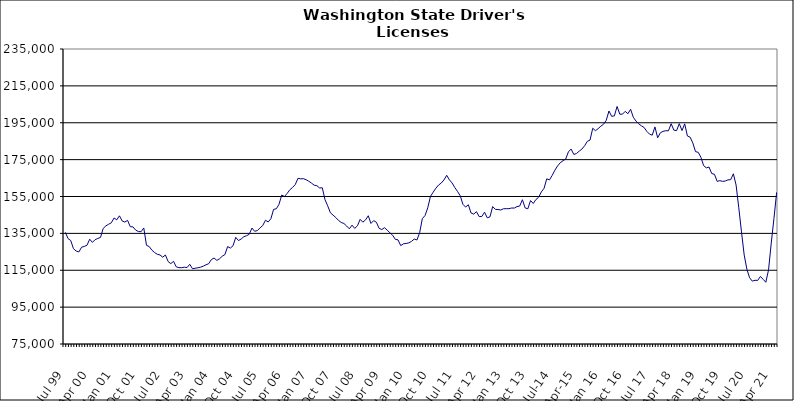
| Category | Series 0 |
|---|---|
| Jul 99 | 135560 |
| Aug 99 | 132182 |
| Sep 99 | 131104 |
| Oct 99 | 126694 |
| Nov 99 | 125425 |
| Dec 99 | 124927 |
| Jan 00 | 127499 |
| Feb 00 | 127927 |
| Mar 00 | 128547 |
| Apr 00 | 131834 |
| May 00 | 130120 |
| Jun 00 | 131595 |
| Jul 00 | 132236 |
| Aug 00 | 132819 |
| Sep 00 | 137711 |
| Oct 00 | 139063 |
| Nov 00 | 139952 |
| Dec 00 | 140732 |
| Jan 01 | 143338 |
| Feb 01 | 142359 |
| Mar 01 | 144523 |
| Apr 01 | 141758 |
| May 01 | 141135 |
| Jun 01 | 142064 |
| Jul 01 | 138646 |
| Aug 01 | 138530 |
| Sep 01 | 136784 |
| Oct 01 | 135996 |
| Nov 01 | 135917 |
| Dec 01 | 137940 |
| Jan 02 | 128531 |
| Feb 02 | 127848 |
| Mar 02 | 125876 |
| Apr 02 | 124595 |
| May 02 | 123660 |
| Jun 02 | 123282 |
| Jul 02 | 122089 |
| Aug 02 | 123279 |
| Sep 02 | 119727 |
| Oct 02 | 118588 |
| Nov 02 | 119854 |
| Dec 02 | 116851 |
| Jan 03 | 116407 |
| Feb 03 | 116382 |
| Mar 03 | 116648 |
| Apr 03 | 116471 |
| May 03 | 118231 |
| Jun 03 | 115831 |
| Jul 03 | 116082 |
| Aug 03 | 116341 |
| Sep 03 | 116653 |
| Oct 03 | 117212 |
| Nov 03 | 117962 |
| Dec 03 | 118542 |
| Jan 04 | 120817 |
| Feb 04 | 121617 |
| Mar 04 | 120369 |
| Apr 04 | 121200 |
| May 04 | 122609 |
| Jun 04 | 123484 |
| Jul 04 | 127844 |
| Aug 04 | 127025 |
| Sep 04 | 128273 |
| Oct 04 | 132853 |
| Nov 04 | 131106 |
| Dec 04 | 131935 |
| Jan 05 | 133205 |
| Feb 05 | 133736 |
| Mar 05 | 134528 |
| Apr 05 | 137889 |
| May 05 | 136130 |
| Jun 05 | 136523 |
| Jul 05 | 137997 |
| Aug 05 | 139294 |
| Sep 05 | 142140 |
| Oct 05 | 141192 |
| Nov 05 | 142937 |
| Dec 05 | 148013 |
| Jan 06 | 148341 |
| Feb 06 | 150744 |
| Mar 06 | 155794 |
| Apr 06 | 154984 |
| May 06 | 156651 |
| Jun 06 | 158638 |
| Jul 06 | 159911 |
| Aug 06 | 161445 |
| Sep 06 | 164852 |
| Oct 06 | 164570 |
| Nov 06 | 164679 |
| Dec 06 | 164127 |
| Jan 07 | 163271 |
| Feb 07 | 162273 |
| Mar 07 | 161140 |
| Apr 07 | 160860 |
| May 07 | 159633 |
| Jun 07 | 159724 |
| Jul 07 | 153303 |
| Aug 07 | 149939 |
| Sep 07 | 146172 |
| Oct 07 | 144876 |
| Nov 07 | 143613 |
| Dec 07 | 142022 |
| Jan 08 | 140909 |
| Feb 08 | 140368 |
| Mar 08 | 138998 |
| Apr 08 | 137471 |
| May 08 | 139453 |
| Jun 08 | 137680 |
| Jul 08 | 139120 |
| Aug 08 | 142612 |
| Sep-08 | 141071 |
| Oct 08 | 142313 |
| Nov 08 | 144556 |
| Dec 08 | 140394 |
| Jan 09 | 141903 |
| Feb 09 | 141036 |
| Mar 09 | 137751 |
| Apr 09 | 137060 |
| May 09 | 138101 |
| Jun 09 | 136739 |
| Jul 09 | 135317 |
| Aug 09 | 134020 |
| Sep 09 | 131756 |
| Oct 09 | 131488 |
| Nov 09 | 128370 |
| Dec 09 | 129323 |
| Jan 10 | 129531 |
| Feb 10 | 129848 |
| Mar 10 | 130654 |
| Apr 10 | 131929 |
| May 10 | 131429 |
| Jun 10 | 135357 |
| Jul 10 | 143032 |
| Aug 10 | 144686 |
| Sep 10 | 148856 |
| Oct 10 | 155042 |
| Nov 10 | 157328 |
| Dec 10 | 159501 |
| Jan 11 | 161221 |
| Feb 11 | 162312 |
| Mar 11 | 163996 |
| Apr 11 | 166495 |
| May 11 | 164040 |
| Jun 11 | 162324 |
| Jul 11 | 159862 |
| Aug 11 | 157738 |
| Sep 11 | 155430 |
| Oct 11 | 150762 |
| Nov 11 | 149255 |
| Dec 11 | 150533 |
| Jan 12 | 146068 |
| Feb 12 | 145446 |
| Mar 12 | 146788 |
| Apr 12 | 144110 |
| May 12 | 144162 |
| Jun 12 | 146482 |
| Jul 12 | 143445 |
| Aug 12 | 143950 |
| Sep 12 | 149520 |
| Oct 12 | 148033 |
| Nov 12 | 147926 |
| Dec 12 | 147674 |
| Jan 13 | 148360 |
| Feb-13 | 148388 |
| Mar-13 | 148414 |
| Apr 13 | 148749 |
| May 13 | 148735 |
| Jun-13 | 149521 |
| Jul 13 | 149837 |
| Aug 13 | 153252 |
| Sep 13 | 148803 |
| Oct 13 | 148315 |
| Nov 13 | 152804 |
| Dec 13 | 151209 |
| Jan 14 | 153357 |
| Feb-14 | 154608 |
| Mar 14 | 157479 |
| Apr 14 | 159441 |
| May 14 | 164591 |
| Jun 14 | 163995 |
| Jul-14 | 166411 |
| Aug-14 | 169272 |
| Sep 14 | 171565 |
| Oct 14 | 173335 |
| Nov 14 | 174406 |
| Dec 14 | 175302 |
| Jan 15 | 179204 |
| Feb 15 | 180737 |
| Mar 15 | 177810 |
| Apr-15 | 178331 |
| May 15 | 179601 |
| Jun-15 | 180729 |
| Jul 15 | 182540 |
| Aug 15 | 184924 |
| Sep 15 | 185620 |
| Oct 15 | 192002 |
| Nov 15 | 190681 |
| Dec 15 | 191795 |
| Jan 16 | 193132 |
| Feb 16 | 194206 |
| Mar 16 | 196319 |
| Apr 16 | 201373 |
| May 16 | 198500 |
| Jun 16 | 198743 |
| Jul 16 | 203841 |
| Aug 16 | 199630 |
| Sep 16 | 199655 |
| Oct 16 | 201181 |
| Nov 16 | 199888 |
| Dec 16 | 202304 |
| Jan 17 | 197977 |
| Feb 17 | 195889 |
| Mar 17 | 194438 |
| Apr 17 | 193335 |
| May 17 | 192430 |
| Jun 17 | 190298 |
| Jul 17 | 188832 |
| Aug 17 | 188264 |
| Sep 17 | 192738 |
| Oct 17 | 186856 |
| Nov 17 | 189537 |
| Dec 17 | 190341 |
| Jan 18 | 190670 |
| Feb 18 | 190645 |
| Mar 18 | 194476 |
| Apr 18 | 190971 |
| May 18 | 190707 |
| Jun 18 | 194516 |
| Jul 18 | 190783 |
| Aug 18 | 194390 |
| Sep 18 | 187831 |
| Oct 18 | 187188 |
| Nov 18 | 184054 |
| Dec 18 | 179347 |
| Jan 19 | 178958 |
| Feb 19 | 176289 |
| Mar 19 | 171747 |
| Apr 19 | 170532 |
| May 19 | 170967 |
| Jun 19 | 167444 |
| Jul 19 | 167059 |
| Aug 19 | 163194 |
| Sep 19 | 163599 |
| Oct 19 | 163212 |
| Nov 19 | 163388 |
| Dec 19 | 164024 |
| Jan 20 | 164114 |
| Feb 20 | 167320 |
| Mar 20 | 161221 |
| Apr 20 | 148866 |
| May 20 | 135821 |
| Jun 20 | 123252 |
| Jul 20 | 115526 |
| Aug 20 | 110940 |
| Sep 20 | 109099 |
| Oct 20 | 109566 |
| Nov 20 | 109488 |
| Dec 20 | 111658 |
| Jan 21 | 110070 |
| Feb 21 | 108491 |
| Mar 21 | 115176 |
| Apr 21 | 129726 |
| May 21 | 143052 |
| Jun 21 | 157253 |